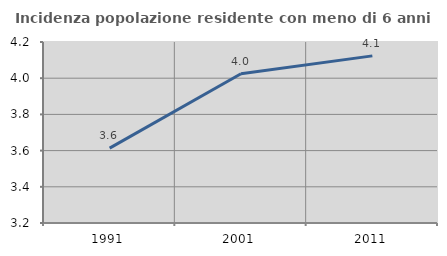
| Category | Incidenza popolazione residente con meno di 6 anni |
|---|---|
| 1991.0 | 3.613 |
| 2001.0 | 4.025 |
| 2011.0 | 4.123 |